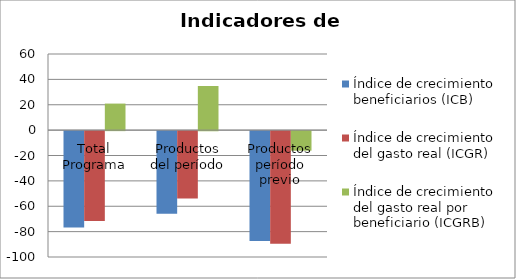
| Category | Índice de crecimiento beneficiarios (ICB)  | Índice de crecimiento del gasto real (ICGR)  | Índice de crecimiento del gasto real por beneficiario (ICGRB)  |
|---|---|---|---|
| Total Programa | -75.925 | -70.888 | 20.92 |
| Productos del período | -65.155 | -53.032 | 34.791 |
| Productos período previo | -86.695 | -88.745 | -15.407 |